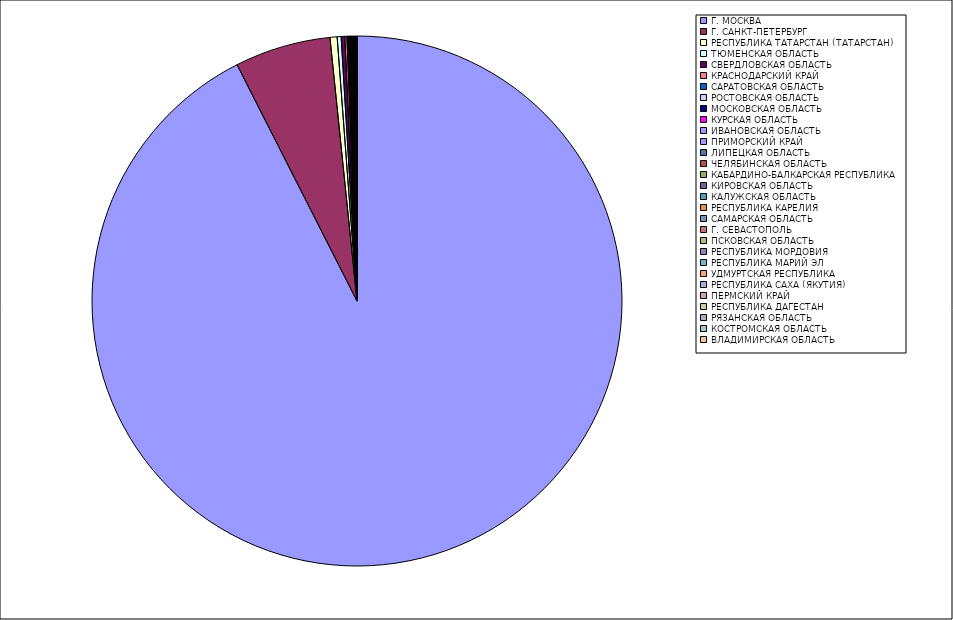
| Category | Оборот |
|---|---|
| Г. МОСКВА | 92.478 |
| Г. САНКТ-ПЕТЕРБУРГ | 5.845 |
| РЕСПУБЛИКА ТАТАРСТАН (ТАТАРСТАН) | 0.433 |
| ТЮМЕНСКАЯ ОБЛАСТЬ | 0.242 |
| СВЕРДЛОВСКАЯ ОБЛАСТЬ | 0.219 |
| КРАСНОДАРСКИЙ КРАЙ | 0.127 |
| САРАТОВСКАЯ ОБЛАСТЬ | 0.077 |
| РОСТОВСКАЯ ОБЛАСТЬ | 0.059 |
| МОСКОВСКАЯ ОБЛАСТЬ | 0.052 |
| КУРСКАЯ ОБЛАСТЬ | 0.046 |
| ИВАНОВСКАЯ ОБЛАСТЬ | 0.043 |
| ПРИМОРСКИЙ КРАЙ | 0.036 |
| ЛИПЕЦКАЯ ОБЛАСТЬ | 0.035 |
| ЧЕЛЯБИНСКАЯ ОБЛАСТЬ | 0.026 |
| КАБАРДИНО-БАЛКАРСКАЯ РЕСПУБЛИКА | 0.024 |
| КИРОВСКАЯ ОБЛАСТЬ | 0.023 |
| КАЛУЖСКАЯ ОБЛАСТЬ | 0.022 |
| РЕСПУБЛИКА КАРЕЛИЯ | 0.021 |
| САМАРСКАЯ ОБЛАСТЬ | 0.021 |
| Г. СЕВАСТОПОЛЬ | 0.018 |
| ПСКОВСКАЯ ОБЛАСТЬ | 0.016 |
| РЕСПУБЛИКА МОРДОВИЯ | 0.015 |
| РЕСПУБЛИКА МАРИЙ ЭЛ | 0.014 |
| УДМУРТСКАЯ РЕСПУБЛИКА | 0.012 |
| РЕСПУБЛИКА САХА (ЯКУТИЯ) | 0.01 |
| ПЕРМСКИЙ КРАЙ | 0.009 |
| РЕСПУБЛИКА ДАГЕСТАН | 0.009 |
| РЯЗАНСКАЯ ОБЛАСТЬ | 0.008 |
| КОСТРОМСКАЯ ОБЛАСТЬ | 0.006 |
| ВЛАДИМИРСКАЯ ОБЛАСТЬ | 0.006 |